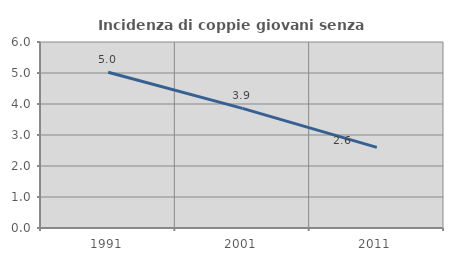
| Category | Incidenza di coppie giovani senza figli |
|---|---|
| 1991.0 | 5.026 |
| 2001.0 | 3.86 |
| 2011.0 | 2.599 |